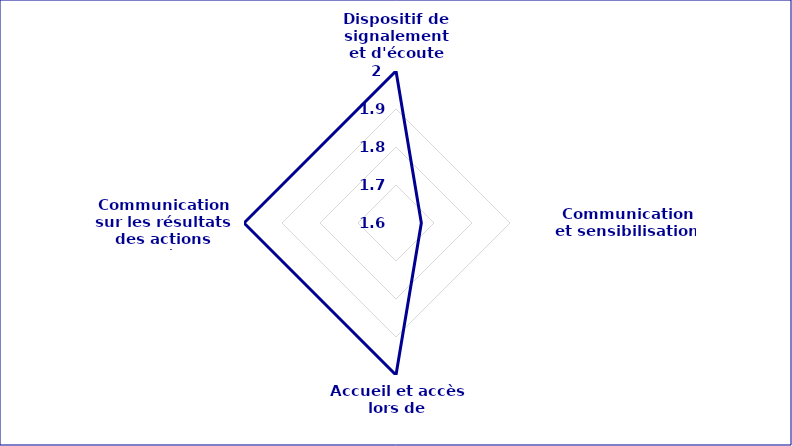
| Category | Series 0 | Series 1 |
|---|---|---|
| Dispositif de signalement et d'écoute |  | 2 |
| Communication et sensibilisation |  | 1.667 |
| Accueil et accès lors de l’événement |  | 2 |
| Communication sur les résultats des actions menées  |  | 2 |